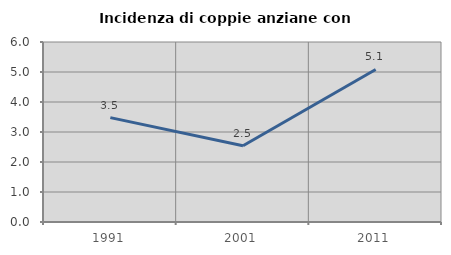
| Category | Incidenza di coppie anziane con figli |
|---|---|
| 1991.0 | 3.478 |
| 2001.0 | 2.542 |
| 2011.0 | 5.085 |